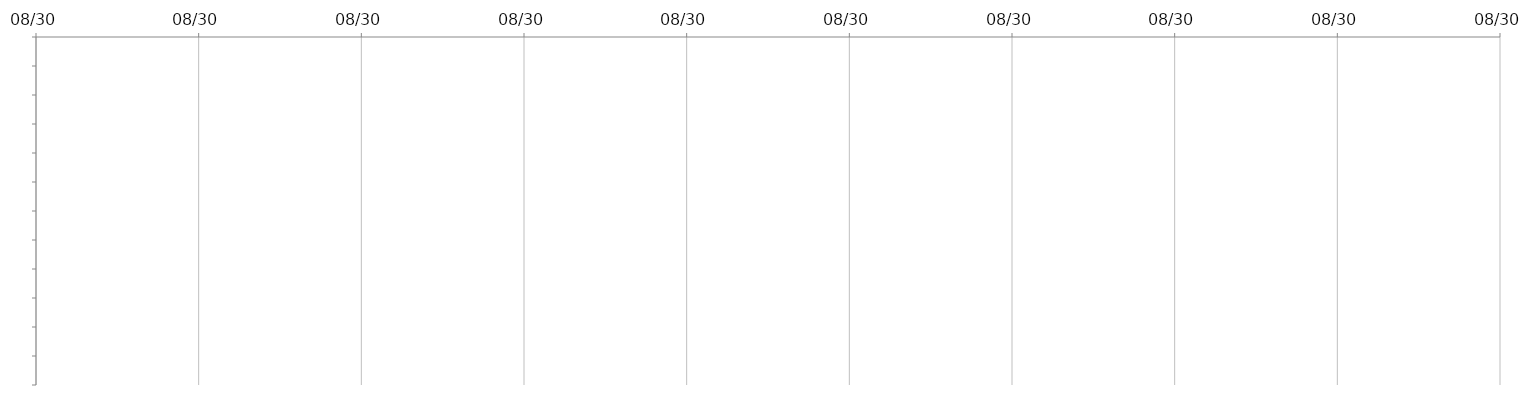
| Category | INÍCIO | DIAS |
|---|---|---|
|  |  | 0 |
|  |  | 0 |
|  |  | 0 |
|  |  | 0 |
|  |  | 0 |
|  |  | 0 |
|  |  | 0 |
|  |  | 0 |
|  |  | 0 |
|  |  | 0 |
|  |  | 0 |
|  |  | 0 |